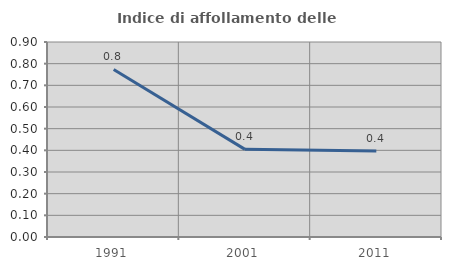
| Category | Indice di affollamento delle abitazioni  |
|---|---|
| 1991.0 | 0.773 |
| 2001.0 | 0.404 |
| 2011.0 | 0.397 |